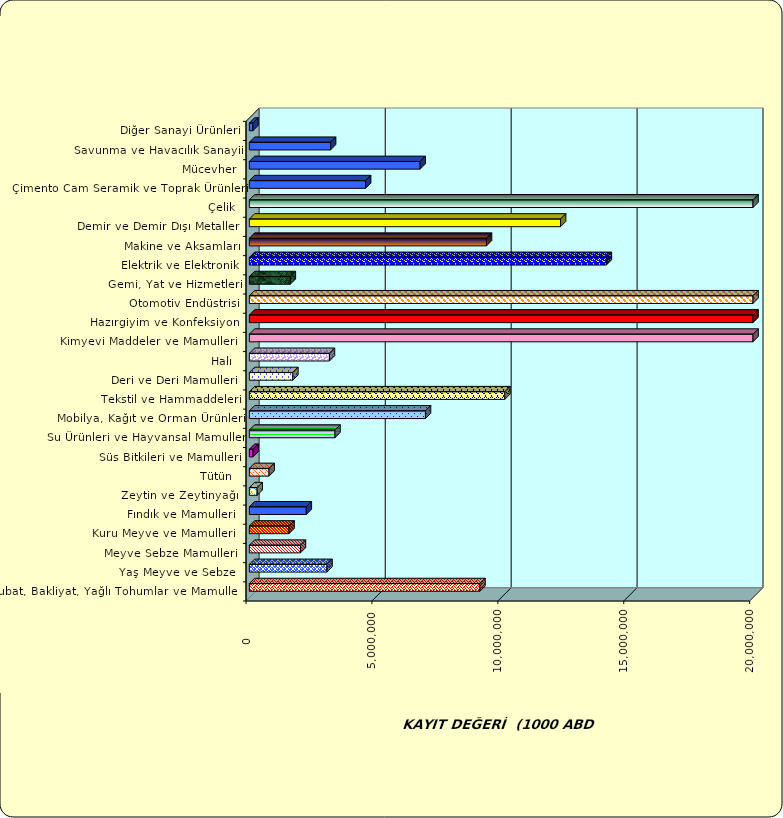
| Category | Series 0 |
|---|---|
|  Hububat, Bakliyat, Yağlı Tohumlar ve Mamulleri  | 9156524.092 |
|  Yaş Meyve ve Sebze   | 3083585.196 |
|  Meyve Sebze Mamulleri  | 2028361.246 |
|  Kuru Meyve ve Mamulleri   | 1574286.867 |
|  Fındık ve Mamulleri  | 2260697.878 |
|  Zeytin ve Zeytinyağı  | 309496.824 |
|  Tütün  | 783002.012 |
|  Süs Bitkileri ve Mamulleri | 147633.783 |
|  Su Ürünleri ve Hayvansal Mamuller | 3400153.671 |
|  Mobilya, Kağıt ve Orman Ürünleri | 6993833.112 |
|  Tekstil ve Hammaddeleri | 10145831.515 |
|  Deri ve Deri Mamulleri  | 1726462.3 |
|  Halı  | 3179483.43 |
|  Kimyevi Maddeler ve Mamulleri   | 25348548.325 |
|  Hazırgiyim ve Konfeksiyon  | 20250437.771 |
|  Otomotiv Endüstrisi | 29342794.835 |
|  Gemi, Yat ve Hizmetleri | 1626376.873 |
|  Elektrik ve Elektronik | 14176022.122 |
|  Makine ve Aksamları | 9416331.638 |
|  Demir ve Demir Dışı Metaller  | 12357449.964 |
|  Çelik | 22351412.72 |
|  Çimento Cam Seramik ve Toprak Ürünleri | 4615380.728 |
|  Mücevher | 6781869.976 |
|  Savunma ve Havacılık Sanayii | 3224785.643 |
|  Diğer Sanayi Ürünleri | 141098.536 |